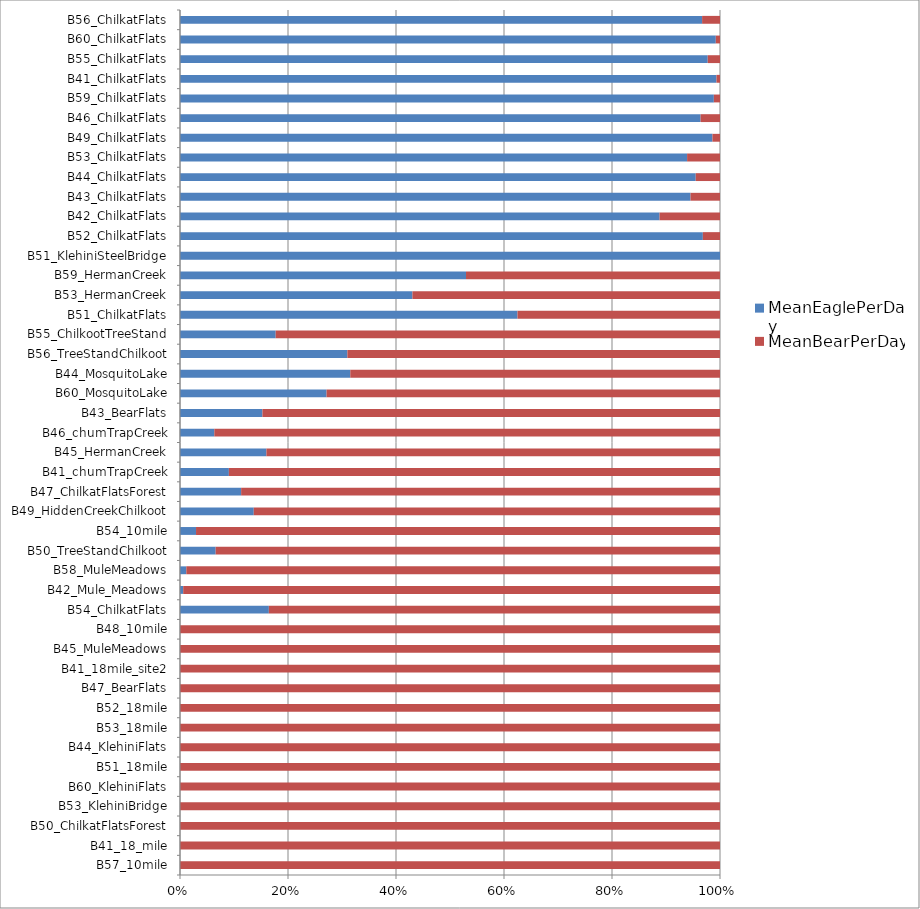
| Category | MeanEaglePerDay | MeanBearPerDay |
|---|---|---|
| B57_10mile | 0 | 0.169 |
| B41_18_mile | 0 | 0.229 |
| B50_ChilkatFlatsForest | 0 | 0.5 |
| B53_KlehiniBridge | 0 | 0.647 |
| B60_KlehiniFlats | 0 | 0.841 |
| B51_18mile | 0 | 0.903 |
| B44_KlehiniFlats | 0 | 1.17 |
| B53_18mile | 0 | 1.194 |
| B52_18mile | 0 | 1.712 |
| B47_BearFlats | 0 | 2.429 |
| B41_18mile_site2 | 0 | 2.545 |
| B45_MuleMeadows | 0 | 5.374 |
| B48_10mile | 0 | 7.967 |
| B54_ChilkatFlats | 0.091 | 0.462 |
| B42_Mule_Meadows | 0.1 | 16.816 |
| B58_MuleMeadows | 0.182 | 15.387 |
| B50_TreeStandChilkoot | 0.2 | 2.827 |
| B54_10mile | 0.25 | 8.173 |
| B49_HiddenCreekChilkoot | 0.277 | 1.748 |
| B47_ChilkatFlatsForest | 0.333 | 2.611 |
| B41_chumTrapCreek | 0.347 | 3.491 |
| B45_HermanCreek | 0.487 | 2.558 |
| B46_chumTrapCreek | 0.517 | 7.626 |
| B43_BearFlats | 0.561 | 3.115 |
| B60_MosquitoLake | 0.726 | 1.948 |
| B44_MosquitoLake | 0.75 | 1.628 |
| B56_TreeStandChilkoot | 0.857 | 1.908 |
| B55_ChilkootTreeStand | 1.167 | 5.417 |
| B51_ChilkatFlats | 1.25 | 0.75 |
| B53_HermanCreek | 1.842 | 2.438 |
| B59_HermanCreek | 3.37 | 2.993 |
| B51_KlehiniSteelBridge | 6.5 | 0 |
| B52_ChilkatFlats | 11.439 | 0.375 |
| B42_ChilkatFlats | 16.193 | 2.041 |
| B43_ChilkatFlats | 19.215 | 1.11 |
| B44_ChilkatFlats | 21.927 | 1.032 |
| B53_ChilkatFlats | 22.43 | 1.456 |
| B49_ChilkatFlats | 24.845 | 0.353 |
| B46_ChilkatFlats | 26.81 | 1 |
| B59_ChilkatFlats | 37.201 | 0.429 |
| B41_ChilkatFlats | 51.272 | 0.339 |
| B55_ChilkatFlats | 51.321 | 1.194 |
| B60_ChilkatFlats | 54.575 | 0.429 |
| B56_ChilkatFlats | 157.959 | 5.416 |